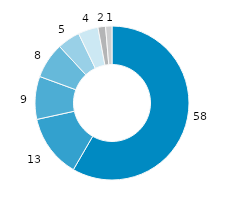
| Category | Nordrhein-Westfalen |
|---|---|
| gesetzliche
Kranken-versicherung | 58.362 |
| private Haushalte u. private Organi-sationen o. E. | 13.217 |
| private
Kranken-versicherung | 9.013 |
| soziale Pflegeversicherung | 7.503 |
| öffentliche Haushalte | 4.771 |
| Arbeitgeber | 4.202 |
| gesetzliche Unfallversicherung | 1.596 |
| gesetzliche
Renten-
versicherung | 1.335 |